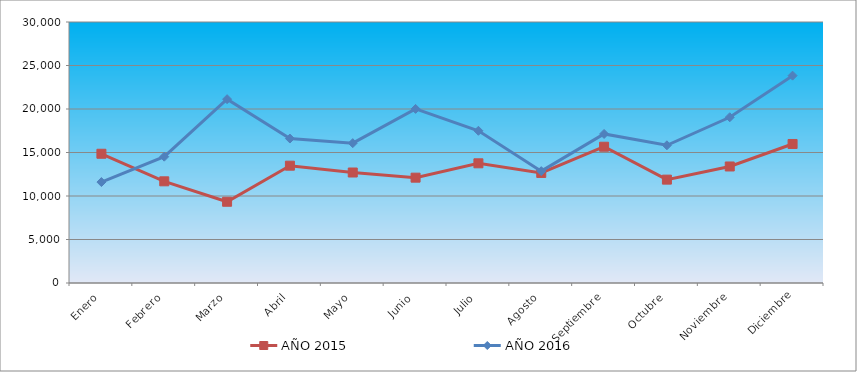
| Category | AÑO 2015 | AÑO 2016 |
|---|---|---|
| Enero | 14856 | 11601 |
| Febrero | 11688 | 14519 |
| Marzo | 9338 | 21130 |
| Abril | 13485 | 16605 |
| Mayo | 12701 | 16075 |
| Junio | 12107 | 20011 |
| Julio | 13758 | 17496 |
| Agosto | 12650 | 12856 |
| Septiembre | 15663 | 17133 |
| Octubre | 11882 | 15827 |
| Noviembre | 13393 | 19050 |
| Diciembre | 15980 | 23833 |